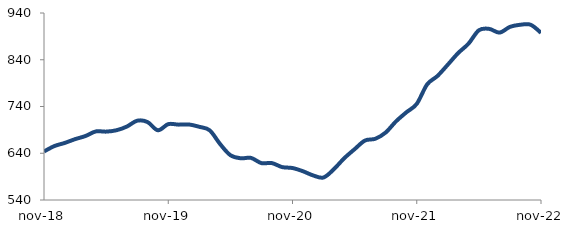
| Category | Series 0 |
|---|---|
| 2018-11-01 | 643.807 |
| 2018-12-01 | 655.34 |
| 2019-01-01 | 662.041 |
| 2019-02-01 | 670.134 |
| 2019-03-01 | 676.827 |
| 2019-04-01 | 686.669 |
| 2019-05-01 | 686.255 |
| 2019-06-01 | 689.181 |
| 2019-07-01 | 697.076 |
| 2019-08-01 | 709.635 |
| 2019-09-01 | 706.734 |
| 2019-10-01 | 689.137 |
| 2019-11-01 | 702.277 |
| 2019-12-01 | 701.214 |
| 2020-01-01 | 701.517 |
| 2020-02-01 | 696.552 |
| 2020-03-01 | 689.099 |
| 2020-04-01 | 659.896 |
| 2020-05-01 | 635.894 |
| 2020-06-01 | 629.29 |
| 2020-07-01 | 629.994 |
| 2020-08-01 | 618.866 |
| 2020-09-01 | 619.022 |
| 2020-10-01 | 610.428 |
| 2020-11-01 | 608.402 |
| 2020-12-01 | 601.605 |
| 2021-01-01 | 592.504 |
| 2021-02-01 | 588.185 |
| 2021-03-01 | 605.989 |
| 2021-04-01 | 629.446 |
| 2021-05-01 | 648.73 |
| 2021-06-01 | 667.177 |
| 2021-07-01 | 670.996 |
| 2021-08-01 | 684.389 |
| 2021-09-01 | 708.308 |
| 2021-10-01 | 727.608 |
| 2021-11-01 | 745.65 |
| 2021-12-01 | 787.184 |
| 2022-01-01 | 805.308 |
| 2022-02-01 | 829.502 |
| 2022-03-01 | 854.336 |
| 2022-04-01 | 874.453 |
| 2022-05-01 | 903.049 |
| 2022-06-01 | 906.022 |
| 2022-07-01 | 898.071 |
| 2022-08-01 | 910.353 |
| 2022-09-01 | 914.859 |
| 2022-10-01 | 914.857 |
| 2022-11-01 | 897.607 |